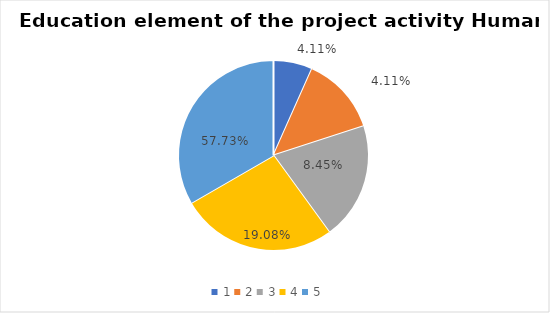
| Category | Series 0 | Series 1 |
|---|---|---|
| 0 | 1 | 0.041 |
| 1 | 2 | 0.041 |
| 2 | 3 | 0.085 |
| 3 | 4 | 0.191 |
| 4 | 5 | 0.577 |